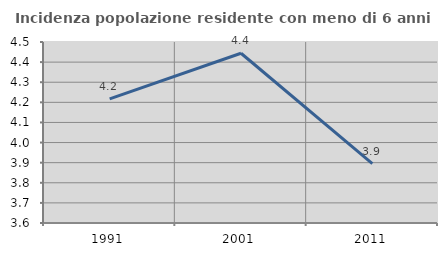
| Category | Incidenza popolazione residente con meno di 6 anni |
|---|---|
| 1991.0 | 4.217 |
| 2001.0 | 4.444 |
| 2011.0 | 3.896 |